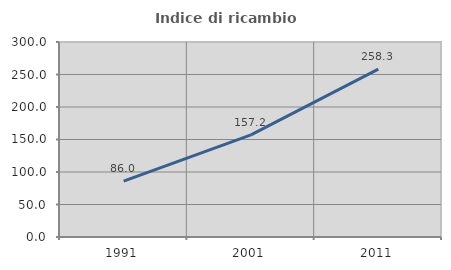
| Category | Indice di ricambio occupazionale  |
|---|---|
| 1991.0 | 86.04 |
| 2001.0 | 157.235 |
| 2011.0 | 258.313 |